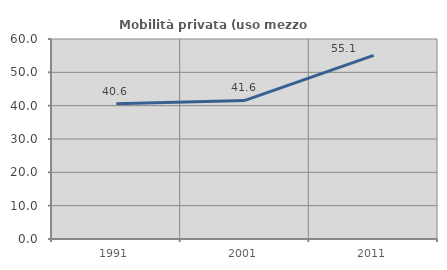
| Category | Mobilità privata (uso mezzo privato) |
|---|---|
| 1991.0 | 40.58 |
| 2001.0 | 41.579 |
| 2011.0 | 55.063 |